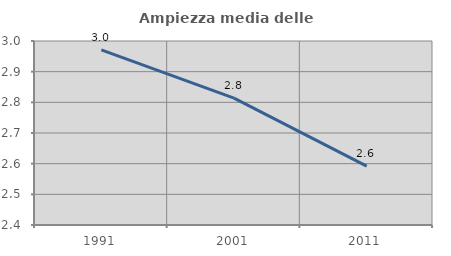
| Category | Ampiezza media delle famiglie |
|---|---|
| 1991.0 | 2.971 |
| 2001.0 | 2.814 |
| 2011.0 | 2.592 |